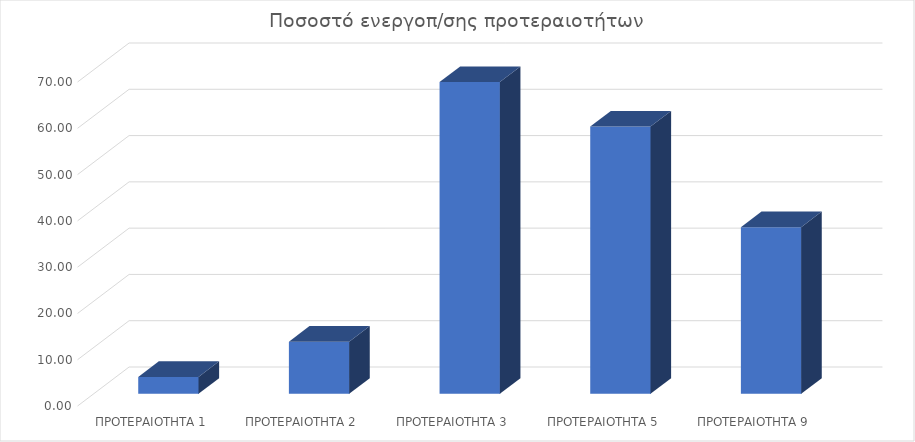
| Category | Series 0 |
|---|---|
| ΠΡΟΤΕΡΑΙΟΤΗΤΑ 1 | 3.64 |
| ΠΡΟΤΕΡΑΙΟΤΗΤΑ 2 | 11.26 |
| ΠΡΟΤΕΡΑΙΟΤΗΤΑ 3 | 67.36 |
| ΠΡΟΤΕΡΑΙΟΤΗΤΑ 5 | 57.73 |
| ΠΡΟΤΕΡΑΙΟΤΗΤΑ 9 | 36 |